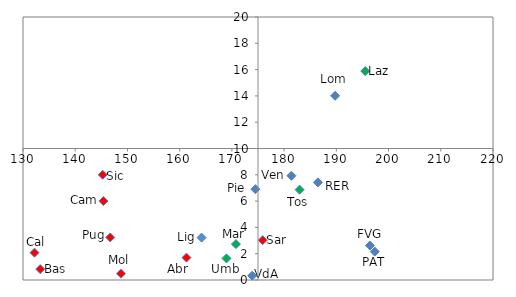
| Category | Series 0 |
|---|---|
| 174.5 | 6.909 |
| 173.9 | 0.324 |
| 189.76666666666665 | 14.007 |
| 181.39999999999998 | 7.928 |
| 196.43333333333337 | 2.62 |
| 164.20000000000002 | 3.222 |
| 186.46666666666667 | 7.422 |
| 182.96666666666667 | 6.869 |
| 168.96666666666667 | 1.639 |
| 170.76666666666665 | 2.729 |
| 195.53333333333333 | 15.887 |
| 161.29999999999998 | 1.702 |
| 148.76666666666665 | 0.48 |
| 145.4 | 6.001 |
| 146.70000000000002 | 3.238 |
| 133.29999999999998 | 0.827 |
| 132.20000000000002 | 2.077 |
| 145.26666666666668 | 8.004 |
| 175.9 | 3.027 |
| 197.36666666666665 | 2.157 |
| 241.0666666666667 | 2.929 |